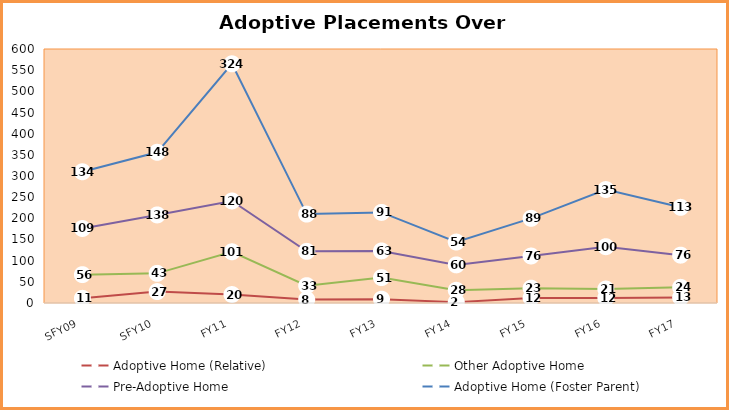
| Category | Adoptive Home (Relative) | Other Adoptive Home | Pre-Adoptive Home | Adoptive Home (Foster Parent) |
|---|---|---|---|---|
| SFY09 | 11 | 56 | 109 | 134 |
| SFY10 | 27 | 43 | 138 | 148 |
| FY11 | 20 | 101 | 120 | 324 |
| FY12 | 8 | 33 | 81 | 88 |
| FY13 | 9 | 51 | 63 | 91 |
| FY14 | 2 | 28 | 60 | 54 |
| FY15 | 12 | 23 | 76 | 89 |
| FY16 | 12 | 21 | 100 | 135 |
| FY17 | 13 | 24 | 76 | 113 |